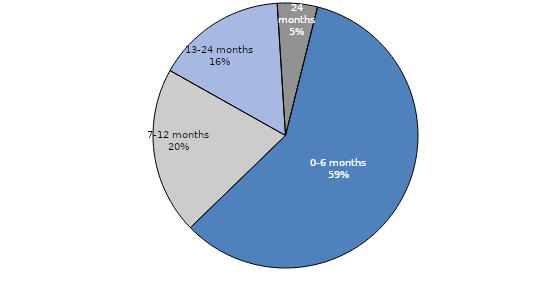
| Category | Series 0 |
|---|---|
| 0-6 months | 58.866 |
| 7-12 months | 20.394 |
| 13-24 months | 15.849 |
| 24+ months | 4.891 |